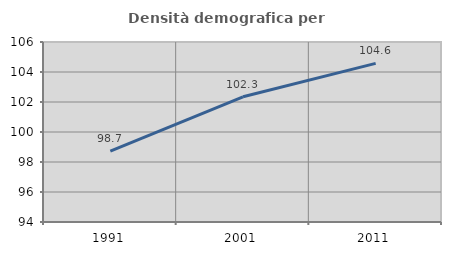
| Category | Densità demografica |
|---|---|
| 1991.0 | 98.72 |
| 2001.0 | 102.345 |
| 2011.0 | 104.576 |